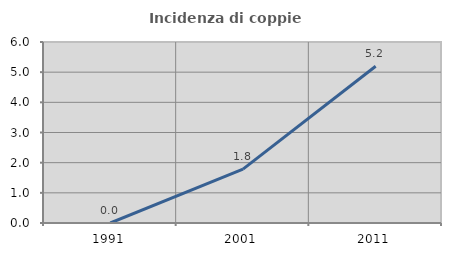
| Category | Incidenza di coppie miste |
|---|---|
| 1991.0 | 0 |
| 2001.0 | 1.786 |
| 2011.0 | 5.198 |